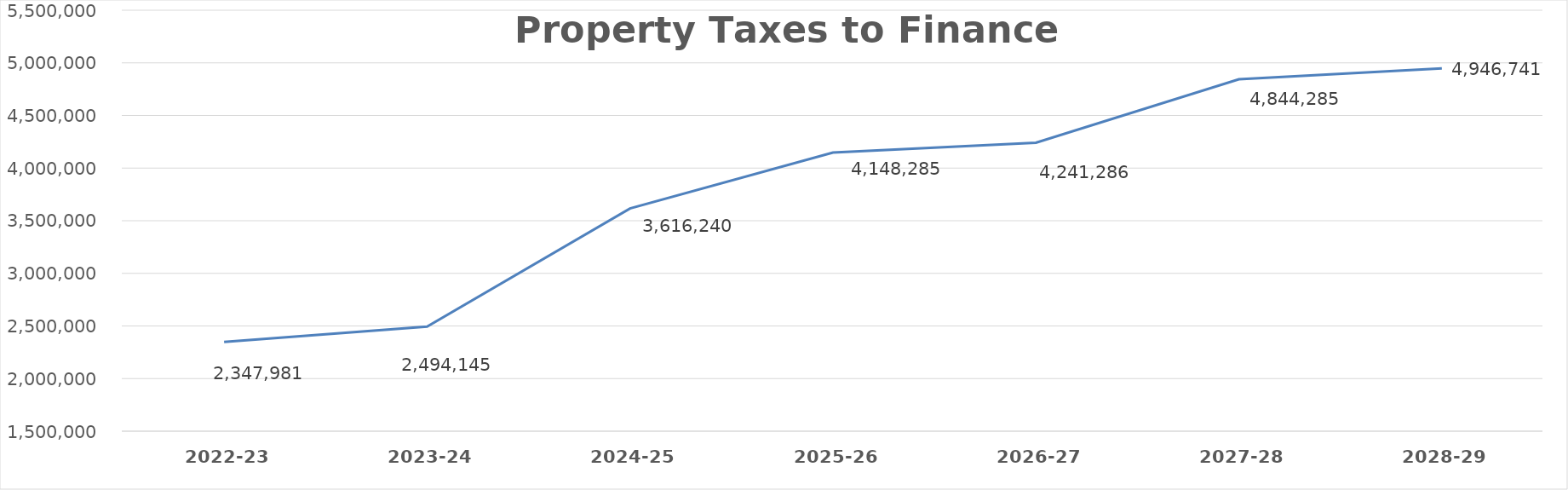
| Category | Series 0 |
|---|---|
| 2022-23 | 2347981 |
| 2023-24 | 2494145 |
| 2024-25 | 3616240 |
| 2025-26 | 4148285 |
| 2026-27 | 4241286 |
| 2027-28 | 4844285 |
| 2028-29 | 4946741 |